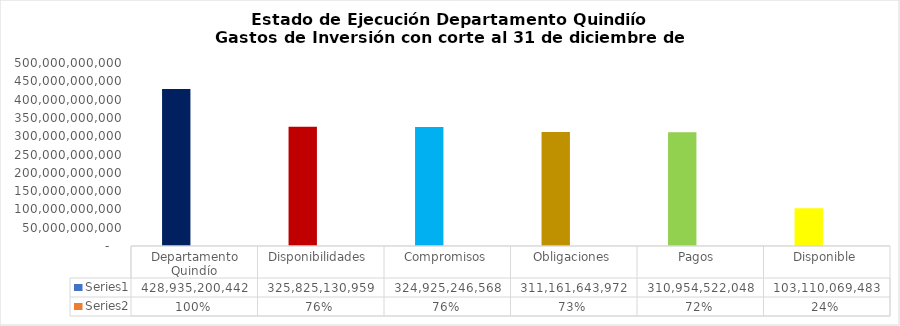
| Category | Series 0 | Series 1 |
|---|---|---|
| Departamento Quindío | 428935200441.5 | 1 |
| Disponibilidades  | 325825130958.69 | 0.76 |
| Compromisos | 324925246568.3 | 0.758 |
| Obligaciones | 311161643971.6 | 0.725 |
| Pagos  | 310954522047.67 | 0.725 |
| Disponible | 103110069482.81 | 0.24 |